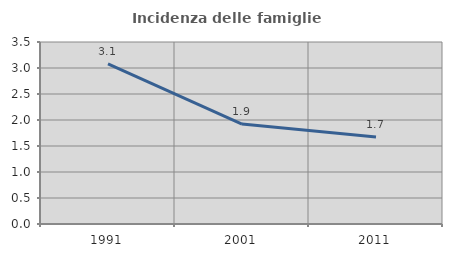
| Category | Incidenza delle famiglie numerose |
|---|---|
| 1991.0 | 3.08 |
| 2001.0 | 1.921 |
| 2011.0 | 1.675 |